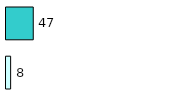
| Category | Series 0 | Series 1 |
|---|---|---|
| 0 | 8 | 47 |